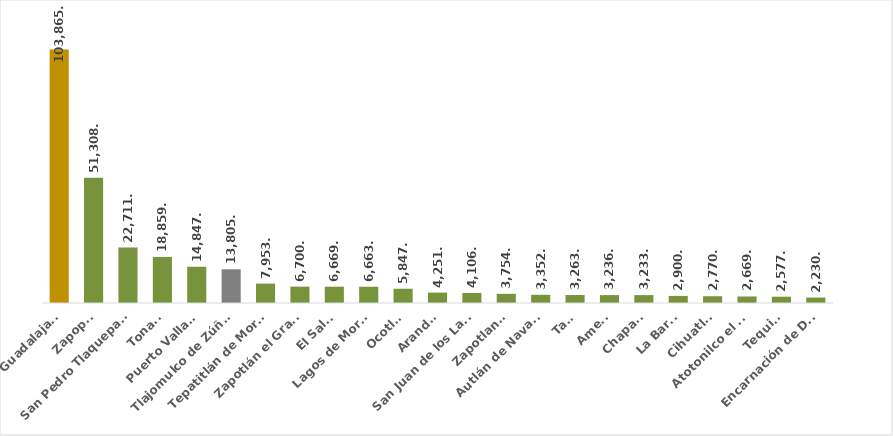
| Category | Series 0 |
|---|---|
| Guadalajara | 103865 |
| Zapopan | 51308 |
| San Pedro Tlaquepaque | 22711 |
| Tonalá | 18859 |
| Puerto Vallarta | 14847 |
| Tlajomulco de Zúñiga | 13805 |
| Tepatitlán de Morelos | 7953 |
| Zapotlán el Grande | 6700 |
| El Salto | 6669 |
| Lagos de Moreno | 6663 |
| Ocotlán | 5847 |
| Arandas | 4251 |
| San Juan de los Lagos | 4106 |
| Zapotlanejo | 3754 |
| Autlán de Navarro | 3352 |
| Tala | 3263 |
| Ameca | 3236 |
| Chapala | 3233 |
| La Barca | 2900 |
| Cihuatlán | 2770 |
| Atotonilco el Alto | 2669 |
| Tequila | 2577 |
| Encarnación de Díaz | 2230 |